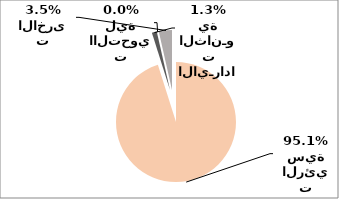
| Category | Series 0 |
|---|---|
| الايرادات الرئيسية | 53918553 |
| الايـرادات الثانـوية | 758339 |
| الايرادات االتحويلية | 5945 |
| الايرادات الاخرى | 2004249 |